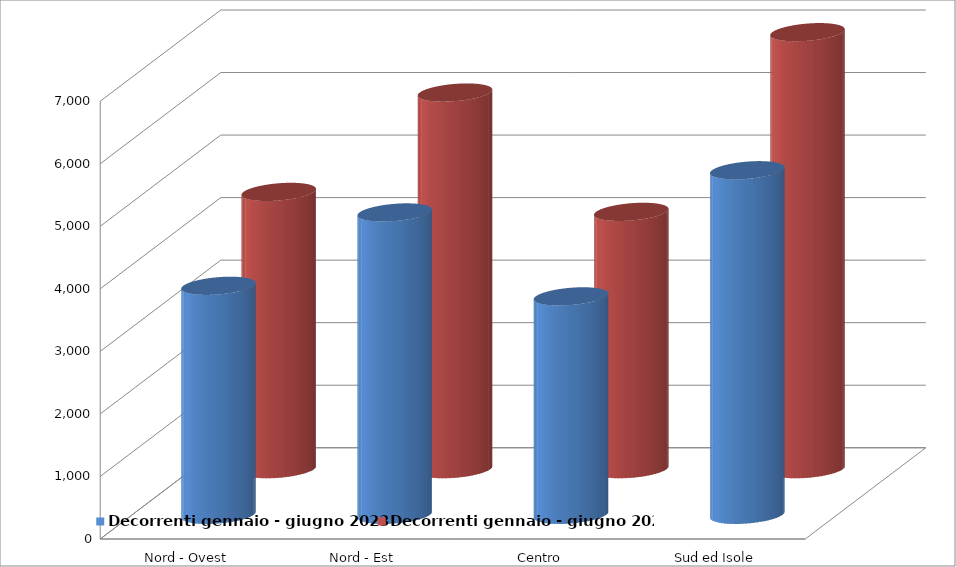
| Category | Decorrenti gennaio - giugno 2023 | Decorrenti gennaio - giugno 2022 |
|---|---|---|
| Nord - Ovest | 3662 | 4434 |
| Nord - Est | 4835 | 6023 |
| Centro | 3493 | 4115 |
| Sud ed Isole | 5510 | 6988 |